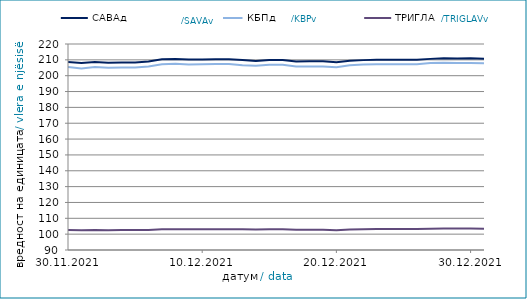
| Category | САВАд | КБПд | ТРИГЛАВд |
|---|---|---|---|
| 2021-11-30 | 208.594 | 205.433 | 102.577 |
| 2021-12-01 | 208.021 | 204.493 | 102.391 |
| 2021-12-02 | 208.68 | 205.558 | 102.619 |
| 2021-12-03 | 208.152 | 204.954 | 102.499 |
| 2021-12-04 | 208.357 | 205.206 | 102.56 |
| 2021-12-05 | 208.363 | 205.213 | 102.563 |
| 2021-12-06 | 209.011 | 205.855 | 102.699 |
| 2021-12-07 | 210.365 | 207.216 | 103.056 |
| 2021-12-08 | 210.575 | 207.513 | 103.086 |
| 2021-12-09 | 210.22 | 207.058 | 103.107 |
| 2021-12-10 | 210.243 | 207.148 | 103.105 |
| 2021-12-11 | 210.413 | 207.355 | 103.15 |
| 2021-12-12 | 210.419 | 207.362 | 103.153 |
| 2021-12-13 | 209.907 | 206.611 | 103.019 |
| 2021-12-14 | 209.221 | 206.27 | 102.93 |
| 2021-12-15 | 209.839 | 206.931 | 103.03 |
| 2021-12-16 | 209.903 | 206.903 | 103.058 |
| 2021-12-17 | 209.015 | 205.809 | 102.76 |
| 2021-12-18 | 209.057 | 205.847 | 102.773 |
| 2021-12-19 | 209.062 | 205.854 | 102.776 |
| 2021-12-20 | 208.409 | 205.311 | 102.529 |
| 2021-12-21 | 209.424 | 206.56 | 102.898 |
| 2021-12-22 | 209.824 | 207.012 | 103.123 |
| 2021-12-23 | 210.075 | 207.27 | 103.254 |
| 2021-12-24 | 210.075 | 207.267 | 103.271 |
| 2021-12-25 | 210.035 | 207.218 | 103.255 |
| 2021-12-26 | 210.04 | 207.225 | 103.258 |
| 2021-12-27 | 210.612 | 207.934 | 103.485 |
| 2021-12-28 | 211.037 | 208.104 | 103.563 |
| 2021-12-29 | 210.878 | 208.043 | 103.55 |
| 2021-12-30 | 210.991 | 208.016 | 103.54 |
| 2021-12-31 | 210.75 | 207.794 | 103.476 |